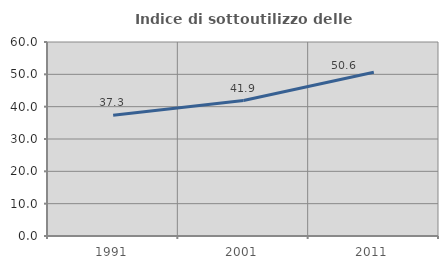
| Category | Indice di sottoutilizzo delle abitazioni  |
|---|---|
| 1991.0 | 37.335 |
| 2001.0 | 41.886 |
| 2011.0 | 50.619 |